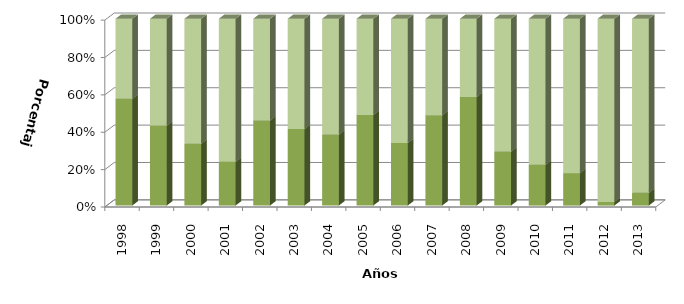
| Category | Buenos Aires | Total país |
|---|---|---|
| 1998.0 | 57.125 | 42.875 |
| 1999.0 | 42.783 | 57.217 |
| 2000.0 | 33.06 | 66.94 |
| 2001.0 | 23.42 | 76.58 |
| 2002.0 | 45.578 | 54.422 |
| 2003.0 | 40.924 | 59.076 |
| 2004.0 | 38.013 | 61.987 |
| 2005.0 | 48.536 | 51.464 |
| 2006.0 | 33.497 | 66.503 |
| 2007.0 | 48.358 | 51.642 |
| 2008.0 | 58.179 | 41.821 |
| 2009.0 | 28.888 | 71.112 |
| 2010.0 | 21.844 | 78.156 |
| 2011.0 | 17.393 | 82.607 |
| 2012.0 | 1.98 | 98.02 |
| 2013.0 | 6.831 | 93.169 |